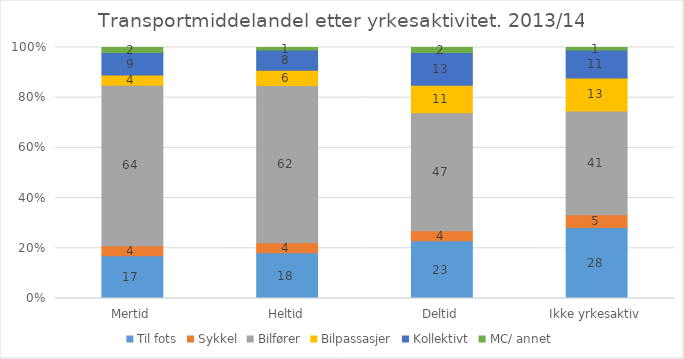
| Category | Til fots | Sykkel | Bilfører | Bilpassasjer | Kollektivt | MC/ annet |
|---|---|---|---|---|---|---|
| Mertid | 17 | 4 | 64 | 4 | 9 | 2 |
| Heltid | 18 | 4 | 62 | 6 | 8 | 1 |
| Deltid | 23 | 4 | 47 | 11 | 13 | 2 |
| Ikke yrkesaktiv | 28 | 5 | 41 | 13 | 11 | 1 |